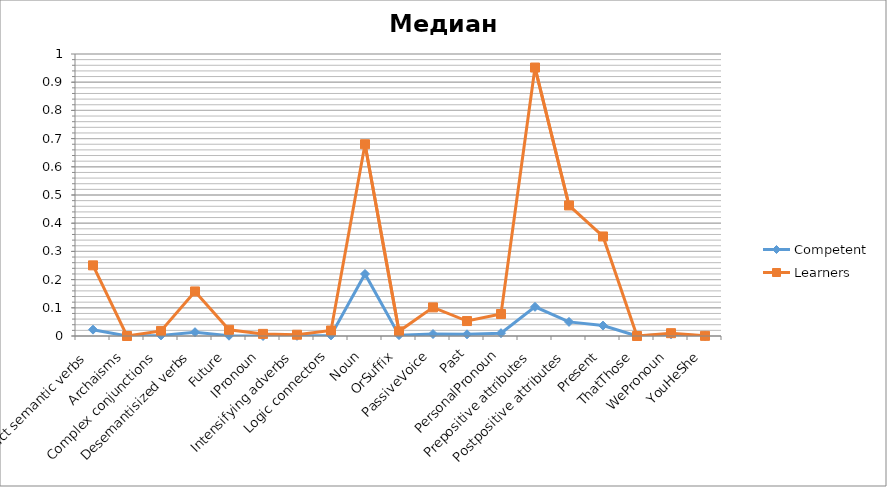
| Category | Competent | Learners |
|---|---|---|
| Abstract semantic verbs | 0.022 | 0.25 |
| Archaisms | 0 | 0 |
| Complex conjunctions | 0.002 | 0.018 |
| Desemantisized verbs | 0.014 | 0.158 |
| Future | 0.001 | 0.022 |
| IPronoun | 0 | 0.008 |
| Intensifying adverbs | 0 | 0.004 |
| Logic connectors | 0.002 | 0.02 |
| Noun | 0.22 | 0.68 |
| OrSuffix | 0.003 | 0.016 |
| PassiveVoice | 0.007 | 0.102 |
| Past | 0.006 | 0.053 |
| PersonalPronoun | 0.01 | 0.078 |
| Prepositive attributes | 0.104 | 0.952 |
| Postpositive attributes | 0.05 | 0.463 |
| Present | 0.037 | 0.353 |
| ThatThose | 0 | 0 |
| WePronoun | 0.006 | 0.01 |
| YouHeShe | 0 | 0 |